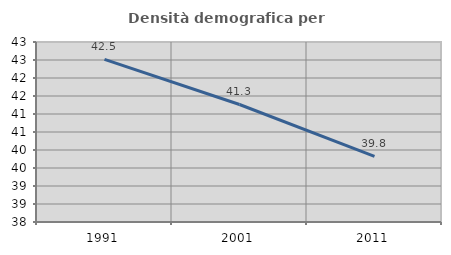
| Category | Densità demografica |
|---|---|
| 1991.0 | 42.516 |
| 2001.0 | 41.264 |
| 2011.0 | 39.824 |